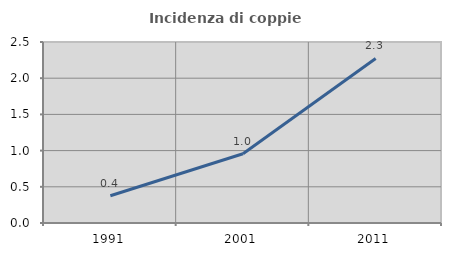
| Category | Incidenza di coppie miste |
|---|---|
| 1991.0 | 0.377 |
| 2001.0 | 0.956 |
| 2011.0 | 2.273 |